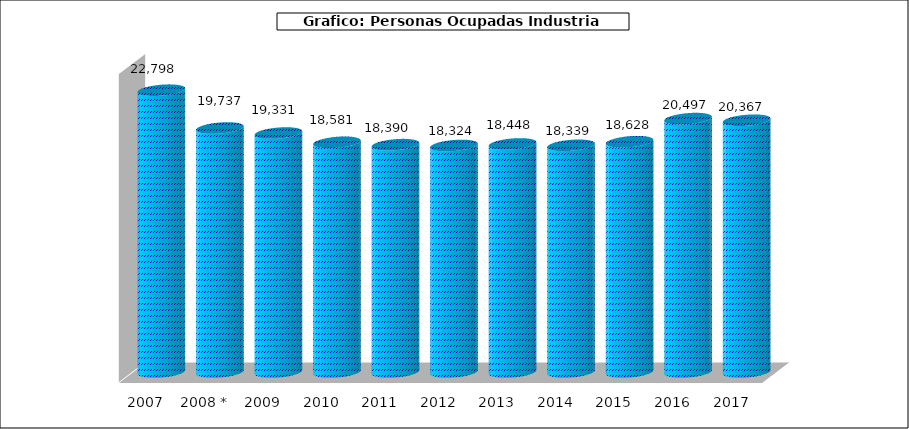
| Category |  Nº Personas Ocupadas Industria Pesquera |
|---|---|
| 2007 | 22798 |
| 2008 * | 19737 |
| 2009 | 19331 |
| 2010 | 18581 |
| 2011 | 18390 |
| 2012 | 18324 |
| 2013 | 18448 |
| 2014 | 18339 |
| 2015 | 18628 |
| 2016 | 20497 |
| 2017 | 20367 |